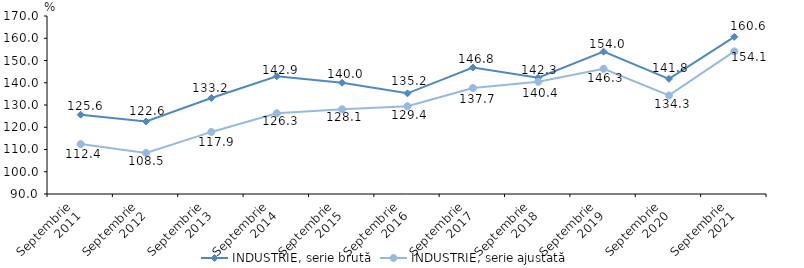
| Category | INDUSTRIE, serie brută | INDUSTRIE, serie ajustată |
|---|---|---|
| Septembrie
2011 | 125.646 | 112.426 |
| Septembrie
2012 | 122.596 | 108.484 |
| Septembrie
2013 | 133.162 | 117.901 |
| Septembrie
2014 | 142.903 | 126.288 |
| Septembrie
2015 | 139.986 | 128.11 |
| Septembrie
2016 | 135.249 | 129.432 |
| Septembrie
2017 | 146.829 | 137.657 |
| Septembrie
2018 | 142.277 | 140.43 |
| Septembrie
2019 | 153.971 | 146.278 |
| Septembrie
2020 | 141.768 | 134.304 |
| Septembrie
2021 | 160.642 | 154.076 |